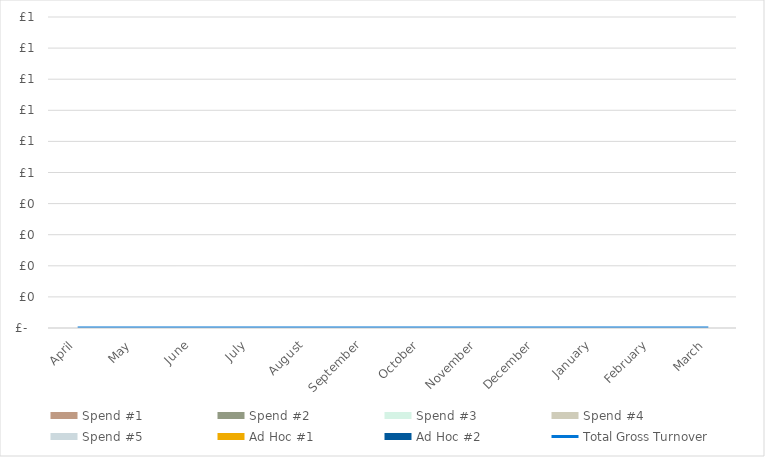
| Category | Spend #1 | Spend #2 | Spend #3 | Spend #4 | Spend #5 | Ad Hoc #1 | Ad Hoc #2 |
|---|---|---|---|---|---|---|---|
| April | 0 | 0 | 0 | 0 | 0 | 0 | 0 |
| May | 0 | 0 | 0 | 0 | 0 | 0 | 0 |
| June | 0 | 0 | 0 | 0 | 0 | 0 | 0 |
| July | 0 | 0 | 0 | 0 | 0 | 0 | 0 |
| August | 0 | 0 | 0 | 0 | 0 | 0 | 0 |
| September | 0 | 0 | 0 | 0 | 0 | 0 | 0 |
| October | 0 | 0 | 0 | 0 | 0 | 0 | 0 |
| November | 0 | 0 | 0 | 0 | 0 | 0 | 0 |
| December | 0 | 0 | 0 | 0 | 0 | 0 | 0 |
| January | 0 | 0 | 0 | 0 | 0 | 0 | 0 |
| February | 0 | 0 | 0 | 0 | 0 | 0 | 0 |
| March | 0 | 0 | 0 | 0 | 0 | 0 | 0 |